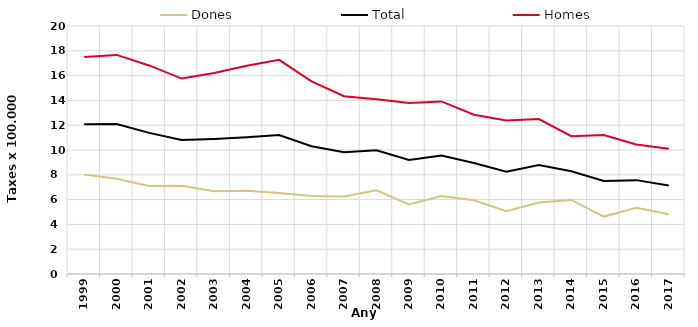
| Category | Dones | Total | Homes |
|---|---|---|---|
| 1999.0 | 8.02 | 12.08 | 17.5 |
| 2000.0 | 7.68 | 12.09 | 17.67 |
| 2001.0 | 7.09 | 11.38 | 16.82 |
| 2002.0 | 7.11 | 10.8 | 15.76 |
| 2003.0 | 6.68 | 10.89 | 16.21 |
| 2004.0 | 6.72 | 11.03 | 16.8 |
| 2005.0 | 6.53 | 11.21 | 17.27 |
| 2006.0 | 6.29 | 10.3 | 15.54 |
| 2007.0 | 6.26 | 9.81 | 14.34 |
| 2008.0 | 6.75 | 9.97 | 14.09 |
| 2009.0 | 5.61 | 9.19 | 13.8 |
| 2010.0 | 6.29 | 9.55 | 13.92 |
| 2011.0 | 5.94 | 8.95 | 12.85 |
| 2012.0 | 5.07 | 8.25 | 12.38 |
| 2013.0 | 5.77 | 8.78 | 12.5 |
| 2014.0 | 5.97 | 8.28 | 11.11 |
| 2015.0 | 4.63 | 7.51 | 11.2 |
| 2016.0 | 5.34 | 7.57 | 10.44 |
| 2017.0 | 4.82 | 7.14 | 10.1 |